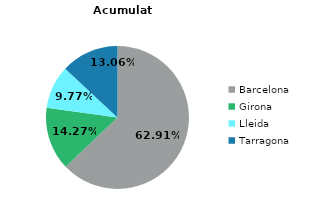
| Category | Acumulat any actual |
|---|---|
| Barcelona | 41037 |
| Girona | 9308 |
| Lleida | 6371 |
| Tarragona | 8520 |